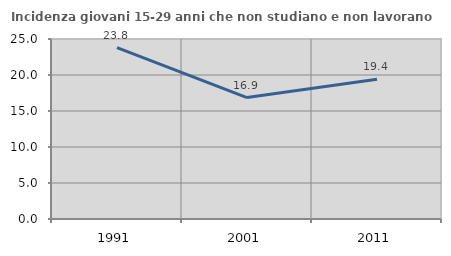
| Category | Incidenza giovani 15-29 anni che non studiano e non lavorano  |
|---|---|
| 1991.0 | 23.81 |
| 2001.0 | 16.87 |
| 2011.0 | 19.42 |